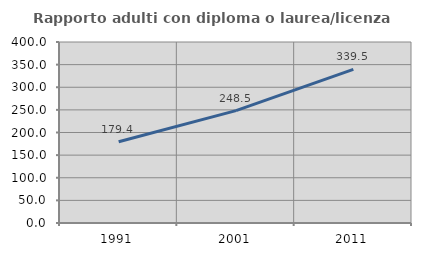
| Category | Rapporto adulti con diploma o laurea/licenza media  |
|---|---|
| 1991.0 | 179.426 |
| 2001.0 | 248.454 |
| 2011.0 | 339.546 |